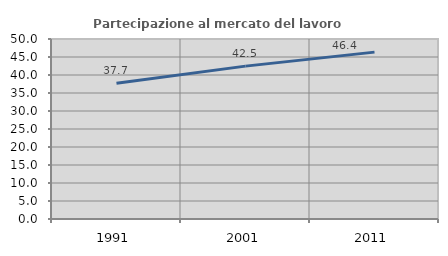
| Category | Partecipazione al mercato del lavoro  femminile |
|---|---|
| 1991.0 | 37.723 |
| 2001.0 | 42.464 |
| 2011.0 | 46.355 |